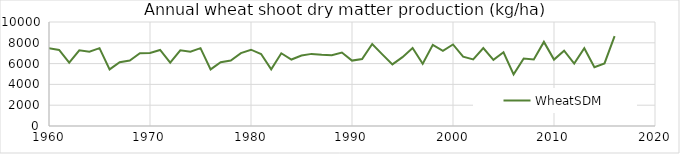
| Category | WheatSDM |
|---|---|
| 1959.0 | 7017.963 |
| 1960.0 | 7482.86 |
| 1961.0 | 7312.137 |
| 1962.0 | 6088.991 |
| 1963.0 | 7279.345 |
| 1964.0 | 7149.152 |
| 1965.0 | 7482.86 |
| 1966.0 | 5440.2 |
| 1967.0 | 6135.649 |
| 1968.0 | 6294.036 |
| 1969.0 | 7004.181 |
| 1970.0 | 7017.963 |
| 1971.0 | 7312.137 |
| 1972.0 | 6088.991 |
| 1973.0 | 7279.345 |
| 1974.0 | 7149.152 |
| 1975.0 | 7482.86 |
| 1976.0 | 5440.2 |
| 1977.0 | 6135.649 |
| 1978.0 | 6294.036 |
| 1979.0 | 7004.181 |
| 1980.0 | 7336.957 |
| 1981.0 | 6923.989 |
| 1982.0 | 5449.352 |
| 1983.0 | 6995.067 |
| 1984.0 | 6391.945 |
| 1985.0 | 6773.776 |
| 1986.0 | 6933.965 |
| 1987.0 | 6850.979 |
| 1988.0 | 6809.554 |
| 1989.0 | 7060.81 |
| 1990.0 | 6289.02 |
| 1991.0 | 6441.696 |
| 1992.0 | 7884.561 |
| 1993.0 | 6890.082 |
| 1994.0 | 5919.938 |
| 1995.0 | 6617.95 |
| 1996.0 | 7503.064 |
| 1997.0 | 5986.328 |
| 1998.0 | 7798.626 |
| 1999.0 | 7224.864 |
| 2000.0 | 7841.043 |
| 2001.0 | 6665.281 |
| 2002.0 | 6406.21 |
| 2003.0 | 7486.731 |
| 2004.0 | 6356.384 |
| 2005.0 | 7093.256 |
| 2006.0 | 4970.912 |
| 2007.0 | 6489.765 |
| 2008.0 | 6388.53 |
| 2009.0 | 8087.481 |
| 2010.0 | 6388.017 |
| 2011.0 | 7246.41 |
| 2012.0 | 6000.573 |
| 2013.0 | 7478.77 |
| 2014.0 | 5657.952 |
| 2015.0 | 6021.892 |
| 2016.0 | 8638.733 |